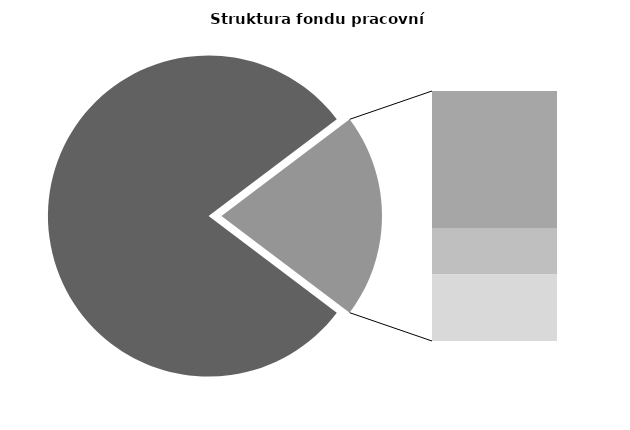
| Category | Series 0 |
|---|---|
| Průměrná měsíční odpracovaná doba bez přesčasu | 136.598 |
| Dovolená | 19.48 |
| Nemoc | 6.477 |
| Jiné | 9.409 |